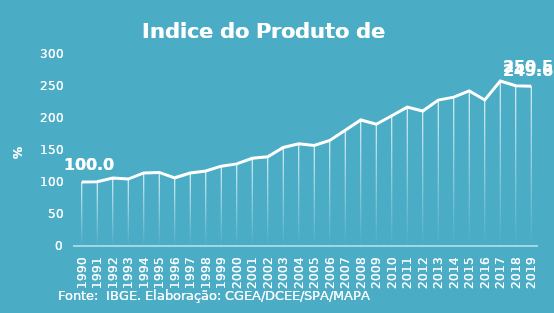
| Category | Indice de Prod. base 1990 |
|---|---|
| 1990.0 | 100 |
| 1991.0 | 100.275 |
| 1992.0 | 106.203 |
| 1993.0 | 104.57 |
| 1994.0 | 114.164 |
| 1995.0 | 115.024 |
| 1996.0 | 106.552 |
| 1997.0 | 114.037 |
| 1998.0 | 117.319 |
| 1999.0 | 124.734 |
| 2000.0 | 128.293 |
| 2001.0 | 136.975 |
| 2002.0 | 139.51 |
| 2003.0 | 153.868 |
| 2004.0 | 159.641 |
| 2005.0 | 157.136 |
| 2006.0 | 164.858 |
| 2007.0 | 180.781 |
| 2008.0 | 196.91 |
| 2009.0 | 190.309 |
| 2010.0 | 203.581 |
| 2011.0 | 217.041 |
| 2012.0 | 210.932 |
| 2013.0 | 228.009 |
| 2014.0 | 232.562 |
| 2015.0 | 242.318 |
| 2016.0 | 228.239 |
| 2017.0 | 257.766 |
| 2018.0 | 250.456 |
| 2019.0 | 249.599 |